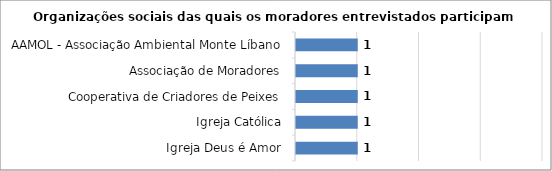
| Category | Series 0 |
|---|---|
| Igreja Deus é Amor | 1 |
| Igreja Católica | 1 |
| Cooperativa de Criadores de Peixes | 1 |
| Associação de Moradores | 1 |
| AAMOL - Associação Ambiental Monte Líbano | 1 |